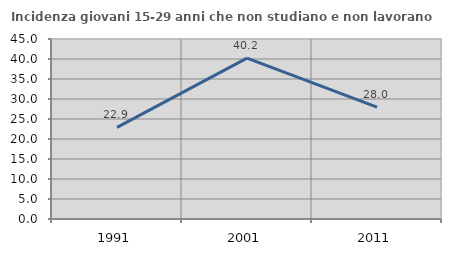
| Category | Incidenza giovani 15-29 anni che non studiano e non lavorano  |
|---|---|
| 1991.0 | 22.895 |
| 2001.0 | 40.201 |
| 2011.0 | 27.979 |